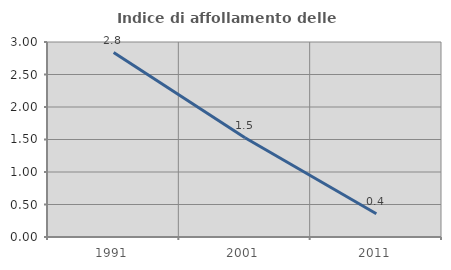
| Category | Indice di affollamento delle abitazioni  |
|---|---|
| 1991.0 | 2.837 |
| 2001.0 | 1.527 |
| 2011.0 | 0.358 |